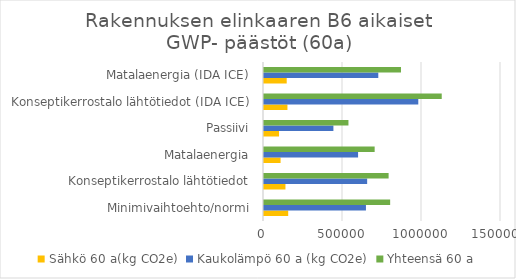
| Category | Sähkö 60 a(kg CO2e) | Kaukolämpö 60 a (kg CO2e) | Yhteensä 60 a |
|---|---|---|---|
| Minimivaihtoehto/normi | 153181.44 | 645264.896 | 798446.336 |
| Konseptikerrostalo lähtötiedot | 135806.4 | 652869.652 | 788676.052 |
| Matalaenergia | 104929.92 | 595414.438 | 700344.358 |
| Passiivi | 95189.76 | 439300.539 | 534490.299 |
| Konseptikerrostalo lähtötiedot (IDA ICE) | 148412.16 | 976500.17 | 1124912.33 |
| Matalaenergia (IDA ICE) | 143688.96 | 723343.927 | 867032.887 |